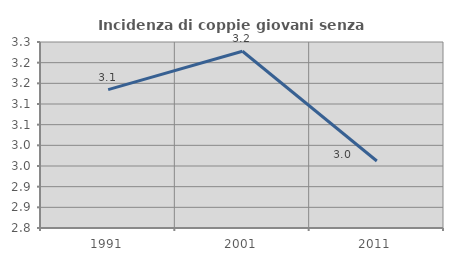
| Category | Incidenza di coppie giovani senza figli |
|---|---|
| 1991.0 | 3.135 |
| 2001.0 | 3.228 |
| 2011.0 | 2.962 |